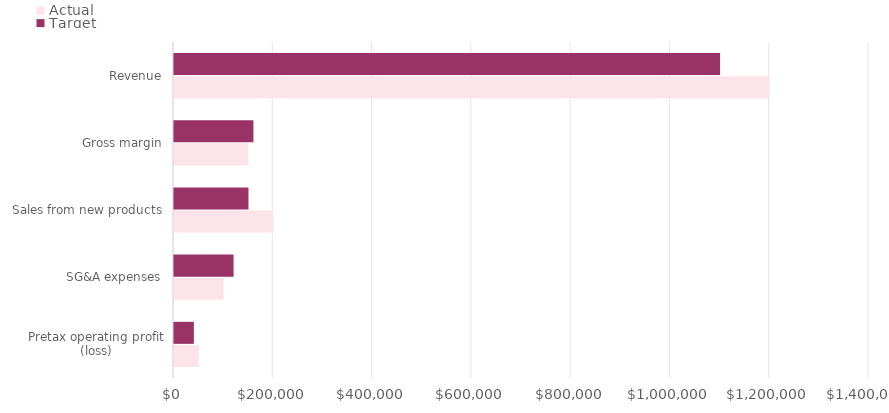
| Category | Actual | Target |
|---|---|---|
| Pretax operating profit (loss) | 50000 | 40000 |
| SG&A expenses | 100000 | 120000 |
| Sales from new products | 200000 | 150000 |
| Gross margin | 150000 | 160000 |
| Revenue | 1200000 | 1100000 |